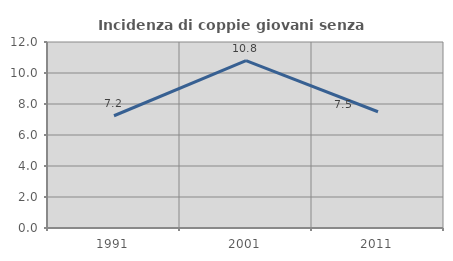
| Category | Incidenza di coppie giovani senza figli |
|---|---|
| 1991.0 | 7.241 |
| 2001.0 | 10.793 |
| 2011.0 | 7.5 |